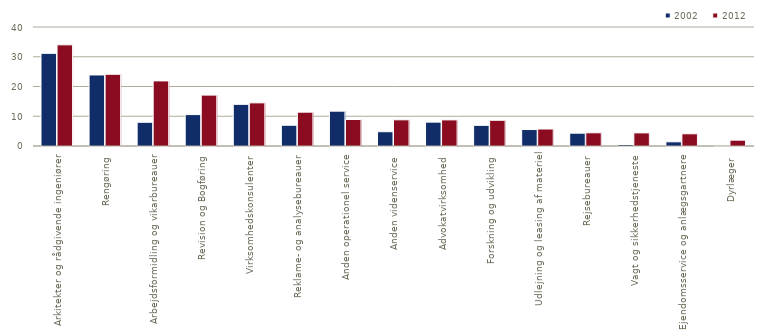
| Category | 2002 | 2012 |
|---|---|---|
| Arkitekter og rådgivende ingeniører | 31.141 | 34.007 |
| Rengøring | 23.88 | 24.111 |
| Arbejdsformidling og vikarbureauer | 7.975 | 21.882 |
| Revision og Bogføring | 10.556 | 17.103 |
| Virksomhedskonsulenter | 14.007 | 14.502 |
| Reklame- og analysebureauer | 6.972 | 11.37 |
| Anden operationel service | 11.709 | 8.907 |
| Anden videnservice | 4.798 | 8.801 |
| Advokatvirksomhed | 8.022 | 8.772 |
| Forskning og udvikling | 6.948 | 8.649 |
| Udlejning og leasing af materiel | 5.534 | 5.711 |
| Rejsebureauer | 4.311 | 4.441 |
| Vagt og sikkerhedstjeneste | 0.498 | 4.408 |
| Ejendomsservice og anlægsgartnere | 1.404 | 4.105 |
| Dyrlæger | 0.004 | 1.965 |